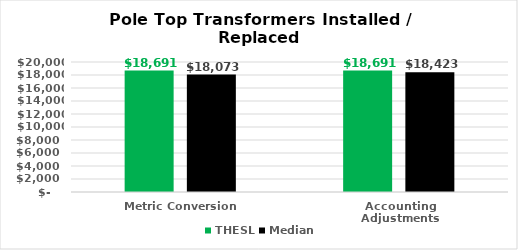
| Category | THESL | Median |
|---|---|---|
| Metric Conversion | 18690.775 | 18073.388 |
| Accounting Adjustments | 18690.775 | 18422.508 |